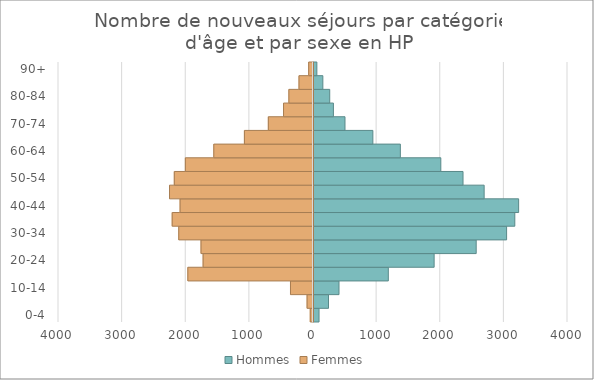
| Category | Hommes | Femmes |
|---|---|---|
| 0-4 | 87 | -43 |
| 5-9 | 236 | -93 |
| 10-14 | 401 | -354 |
| 15-19 | 1176 | -1967 |
| 20-24 | 1896 | -1727 |
| 25-29 | 2557 | -1760 |
| 30-34 | 3035 | -2110 |
| 35-39 | 3164 | -2213 |
| 40-44 | 3224 | -2089 |
| 45-49 | 2682 | -2255 |
| 50-54 | 2350 | -2180 |
| 55-59 | 2001 | -2006 |
| 60-64 | 1365 | -1559 |
| 65-69 | 933 | -1078 |
| 70-74 | 495 | -702 |
| 75-79 | 313 | -463 |
| 80-84 | 255 | -379 |
| 85-89 | 147 | -220 |
| 90+ | 53 | -68 |